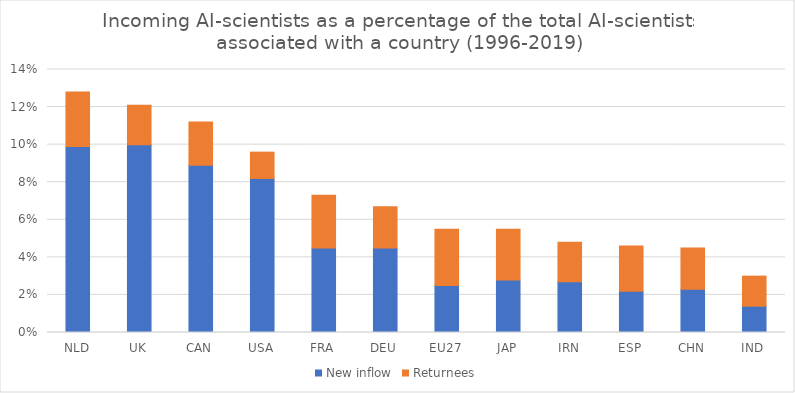
| Category | New inflow | Returnees |
|---|---|---|
| NLD | 0.099 | 0.029 |
| UK | 0.1 | 0.021 |
| CAN | 0.089 | 0.023 |
| USA | 0.082 | 0.014 |
| FRA | 0.045 | 0.028 |
| DEU | 0.045 | 0.022 |
| EU27 | 0.025 | 0.03 |
| JAP | 0.028 | 0.027 |
| IRN | 0.027 | 0.021 |
| ESP | 0.022 | 0.024 |
| CHN | 0.023 | 0.022 |
| IND | 0.014 | 0.016 |